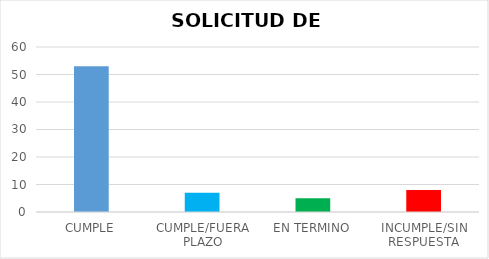
| Category | TOTAL |
|---|---|
| CUMPLE | 53 |
| CUMPLE/FUERA PLAZO | 7 |
| EN TERMINO | 5 |
| INCUMPLE/SIN RESPUESTA | 8 |